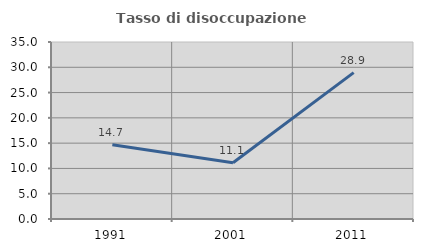
| Category | Tasso di disoccupazione giovanile  |
|---|---|
| 1991.0 | 14.667 |
| 2001.0 | 11.111 |
| 2011.0 | 28.947 |